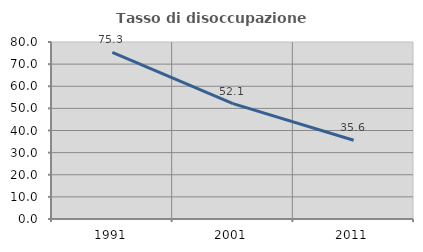
| Category | Tasso di disoccupazione giovanile  |
|---|---|
| 1991.0 | 75.336 |
| 2001.0 | 52.137 |
| 2011.0 | 35.616 |